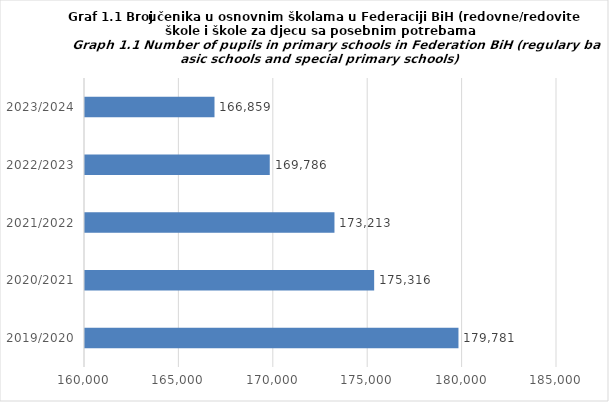
| Category | Series 0 |
|---|---|
| 2019/2020 | 179781 |
| 2020/2021 | 175316 |
| 2021/2022 | 173213 |
| 2022/2023 | 169786 |
| 2023/2024 | 166859 |